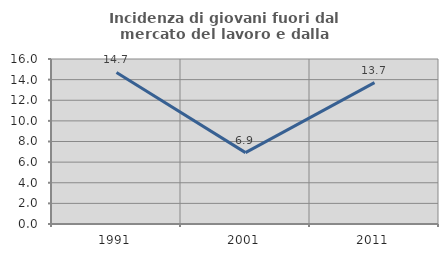
| Category | Incidenza di giovani fuori dal mercato del lavoro e dalla formazione  |
|---|---|
| 1991.0 | 14.692 |
| 2001.0 | 6.923 |
| 2011.0 | 13.71 |